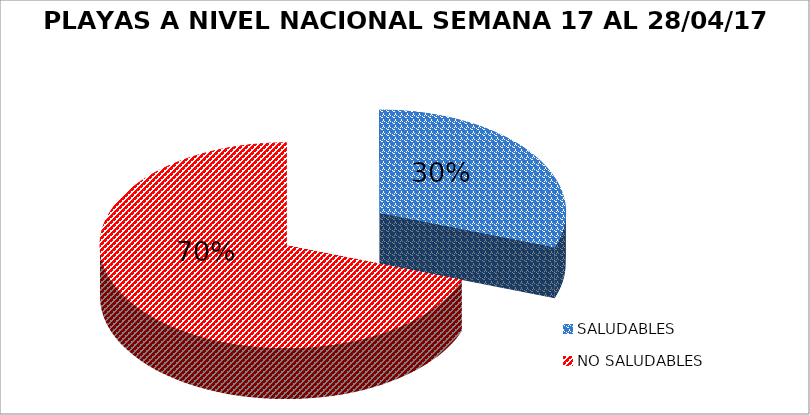
| Category | N.° |
|---|---|
| SALUDABLES | 39 |
| NO SALUDABLES | 89 |